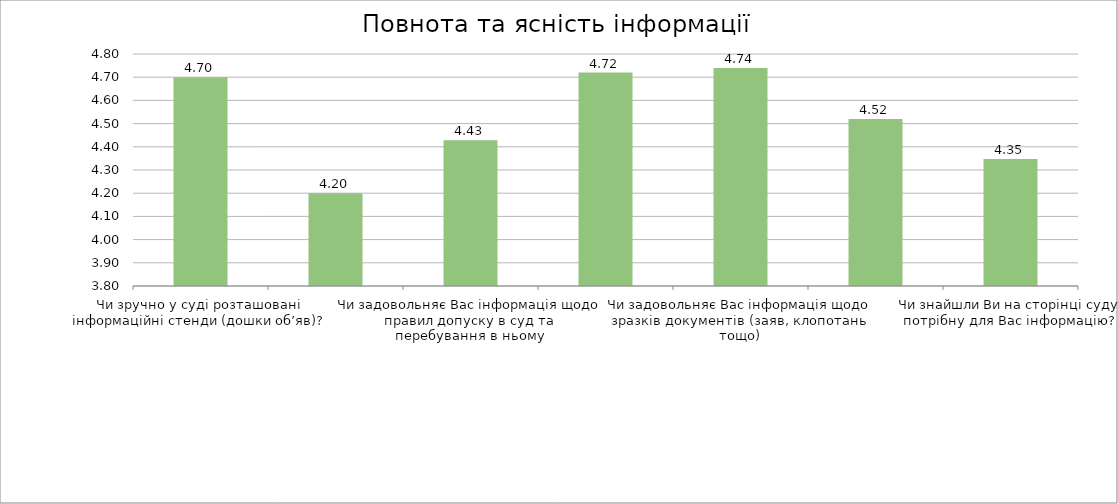
| Category | Series 0 |
|---|---|
| Чи зручно у суді розташовані інформаційні стенди (дошки об’яв)? | 4.7 |
| Чи задовольняє Вас інформація щодо розташування кабінетів, залів судових засідань, інших приміщень | 4.2 |
| Чи задовольняє Вас інформація щодо правил допуску в суд та перебування в ньому | 4.429 |
| Чи задовольняє Вас інформація щодо справ, що призначені до розгляду | 4.72 |
| Чи задовольняє Вас інформація щодо зразків документів (заяв, клопотань тощо) | 4.74 |
| Чи задовольняє Вас інформація щодо порядку сплати судових зборів та мита, реквізити та розміри платежів | 4.52 |
| Чи знайшли Ви на сторінці суду потрібну для Вас інформацію? | 4.348 |